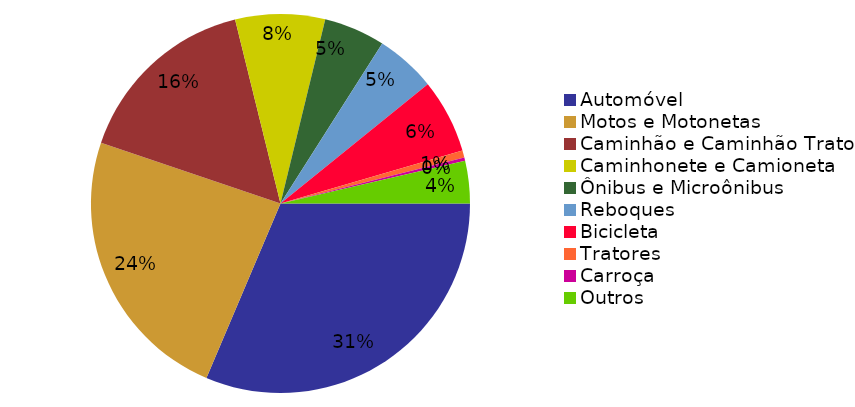
| Category | Qtde Veículos |
|---|---|
| Automóvel | 878 |
| Motos e Motonetas | 666 |
| Caminhão e Caminhão Trator | 446 |
| Caminhonete e Camioneta | 214 |
| Ônibus e Microônibus | 146 |
| Reboques | 144 |
| Bicicleta | 177 |
| Tratores | 17 |
| Carroça | 8 |
| Outros | 101 |